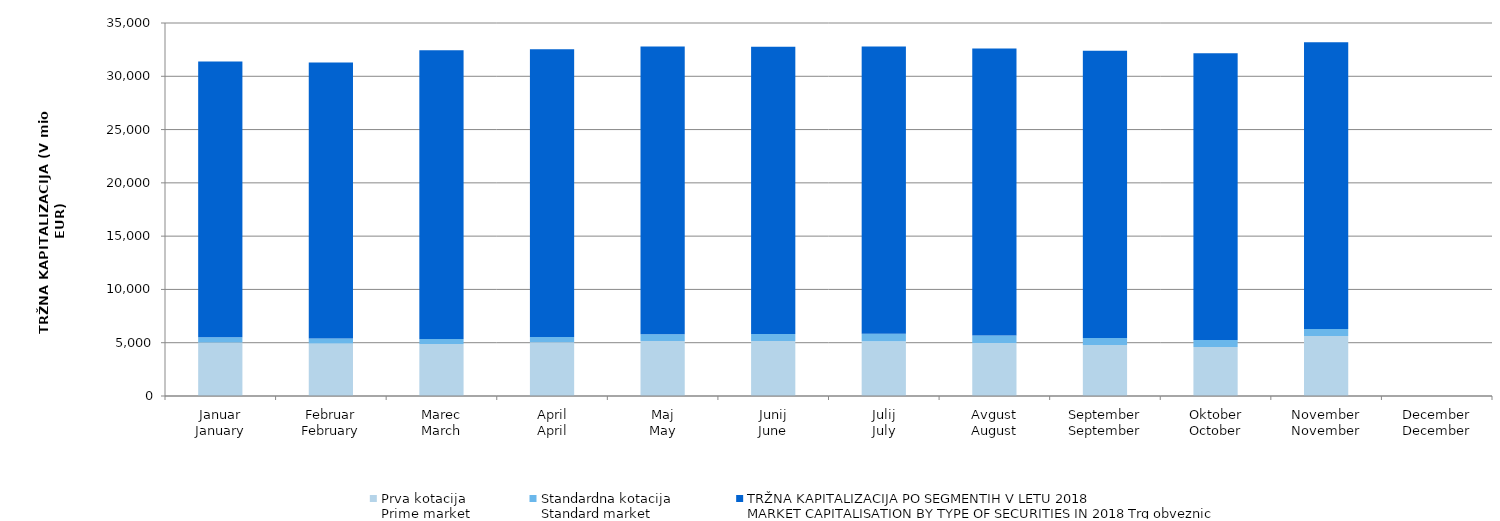
| Category | Prva kotacija
Prime market | Standardna kotacija
Standard market | Series 3 |
|---|---|---|---|
| Januar
January | 5022.792 | 483.67 | 25885.901 |
| Februar
February | 4922.405 | 471.165 | 25899.375 |
| Marec
March | 4884.025 | 463.212 | 27099.633 |
| April
April | 5038.448 | 492.653 | 27015.924 |
| Maj
May | 5153.368 | 630.304 | 27015.655 |
| Junij
June | 5151.963 | 663.065 | 26962.481 |
| Julij
July | 5126.931 | 703.136 | 26961.579 |
| Avgust
August | 4963.893 | 702.004 | 26952.115 |
| September
September | 4788.635 | 655.294 | 26952.079 |
| Oktober
October | 4601.278 | 658.399 | 26904.943 |
| November
November | 5623.421 | 656.539 | 26904.875 |
| December
December | 0 | 0 | 0 |